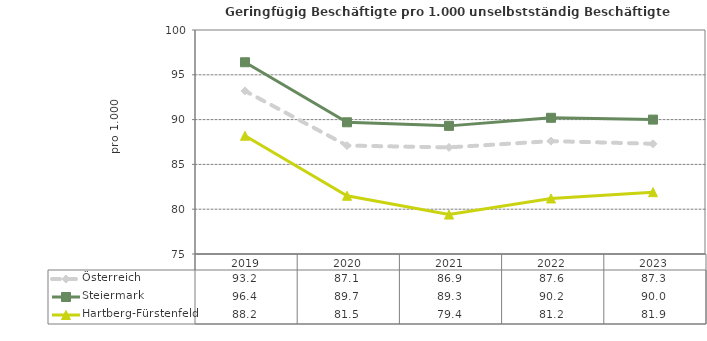
| Category | Österreich | Steiermark | Hartberg-Fürstenfeld |
|---|---|---|---|
| 2023.0 | 87.3 | 90 | 81.9 |
| 2022.0 | 87.6 | 90.2 | 81.2 |
| 2021.0 | 86.9 | 89.3 | 79.4 |
| 2020.0 | 87.1 | 89.7 | 81.5 |
| 2019.0 | 93.2 | 96.4 | 88.2 |